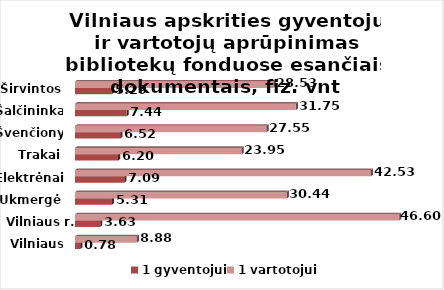
| Category | 1 gyventojui | 1 vartotojui |
|---|---|---|
| Vilniaus m. | 0.777 | 8.881 |
| Vilniaus r. | 3.628 | 46.597 |
| Ukmergė | 5.306 | 30.438 |
| Elektrėnai | 7.085 | 42.526 |
| Trakai | 6.201 | 23.948 |
| Švenčionys | 6.524 | 27.546 |
| Šalčininkai | 7.435 | 31.752 |
| Širvintos | 5.291 | 28.533 |